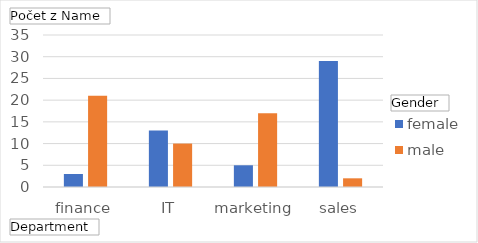
| Category | female | male |
|---|---|---|
| finance | 3 | 21 |
| IT | 13 | 10 |
| marketing | 5 | 17 |
| sales | 29 | 2 |